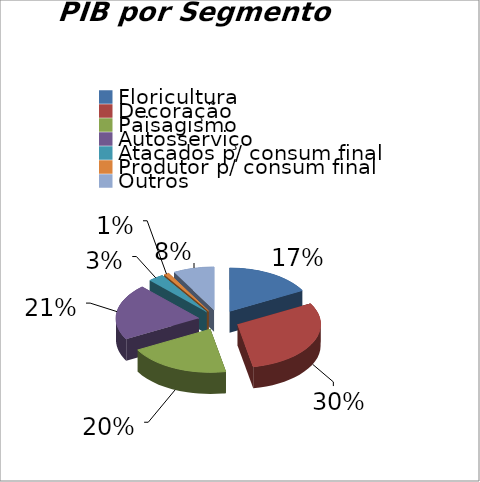
| Category | Series 0 | Series 1 |
|---|---|---|
| Floricultura | 3378240000 | 0.17 |
| Decoração | 5961600000 | 0.3 |
| Paisagismo | 3974400000 | 0.2 |
| Autosserviço | 4173120000 | 0.21 |
| Atacados p/ consum final | 596160000 | 0.03 |
| Produtor p/ consum final | 198720000 | 0.01 |
| Outros | 1589760000 | 0.08 |